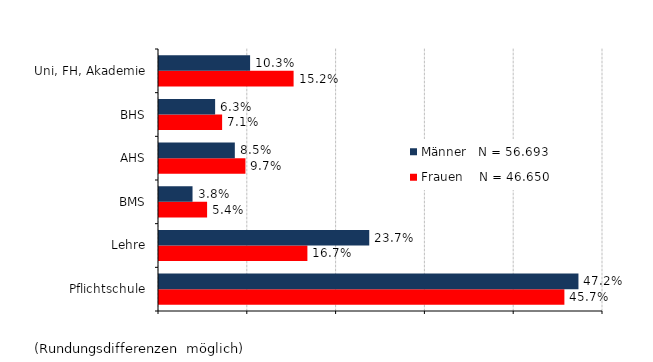
| Category | Frauen    N = 46.650 | Männer   N = 56.693 |
|---|---|---|
| Pflichtschule | 0.457 | 0.472 |
| Lehre | 0.167 | 0.237 |
| BMS | 0.054 | 0.038 |
| AHS | 0.097 | 0.085 |
| BHS | 0.071 | 0.063 |
| Uni, FH, Akademie | 0.152 | 0.103 |